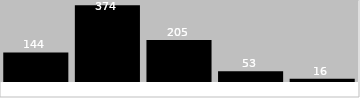
| Category | Basic graphical analysis |
|---|---|
| 0 | 144 |
| 1 | 374 |
| 2 | 205 |
| 3 | 53 |
| 4 | 16 |